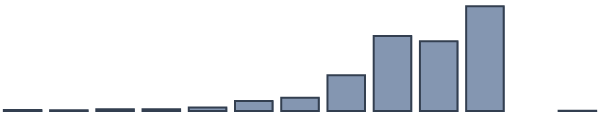
| Category | Series 0 |
|---|---|
| 0 | 0.291 |
| 1 | 0.263 |
| 2 | 0.552 |
| 3 | 0.534 |
| 4 | 1.123 |
| 5 | 3.126 |
| 6 | 4.162 |
| 7 | 11.243 |
| 8 | 23.617 |
| 9 | 21.999 |
| 10 | 33.03 |
| 11 | 0 |
| 12 | 0.052 |